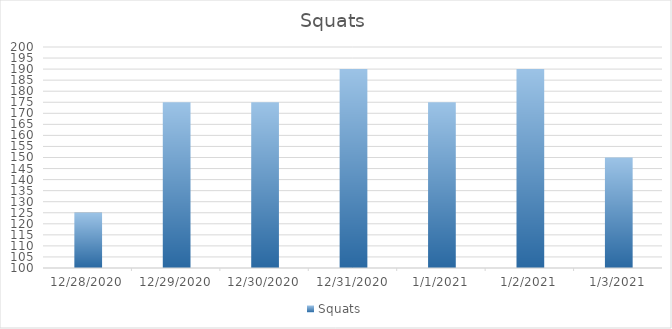
| Category | Squats |
|---|---|
| 12/28/20 | 125 |
| 12/29/20 | 175 |
| 12/30/20 | 175 |
| 12/31/20 | 190 |
| 1/1/21 | 175 |
| 1/2/21 | 190 |
| 1/3/21 | 150 |